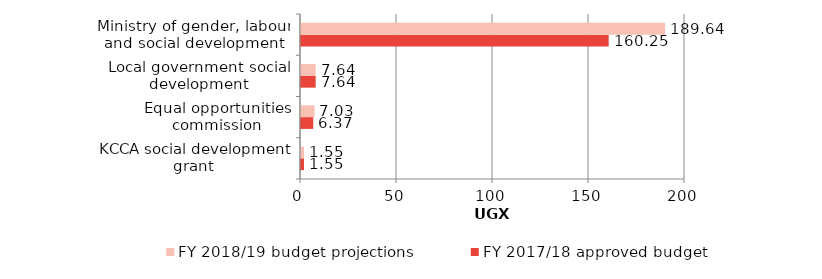
| Category | FY 2017/18 approved budget | FY 2018/19 budget projections |
|---|---|---|
| KCCA social development grant | 1.55 | 1.55 |
| Equal opportunities commission | 6.37 | 7.03 |
| Local government social development | 7.64 | 7.64 |
| Ministry of gender, labour and social development | 160.25 | 189.64 |